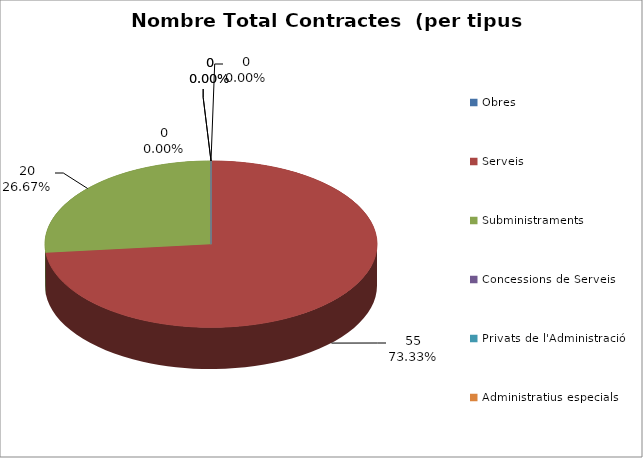
| Category | Nombre Total Contractes |
|---|---|
| Obres | 0 |
| Serveis | 55 |
| Subministraments | 20 |
| Concessions de Serveis | 0 |
| Privats de l'Administració | 0 |
| Administratius especials | 0 |